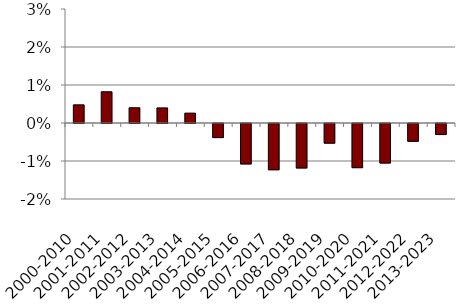
| Category | 60/40 |
|---|---|
| 2000-2010 | 0.005 |
| 2001-2011 | 0.008 |
| 2002-2012 | 0.004 |
| 2003-2013 | 0.004 |
| 2004-2014 | 0.003 |
| 2005-2015 | -0.004 |
| 2006-2016 | -0.011 |
| 2007-2017 | -0.012 |
| 2008-2018 | -0.012 |
| 2009-2019 | -0.005 |
| 2010-2020 | -0.012 |
| 2011-2021 | -0.01 |
| 2012-2022 | -0.005 |
| 2013-2023 | -0.003 |